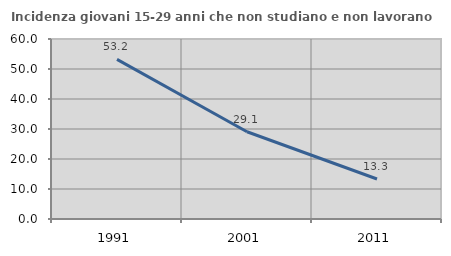
| Category | Incidenza giovani 15-29 anni che non studiano e non lavorano  |
|---|---|
| 1991.0 | 53.206 |
| 2001.0 | 29.091 |
| 2011.0 | 13.333 |